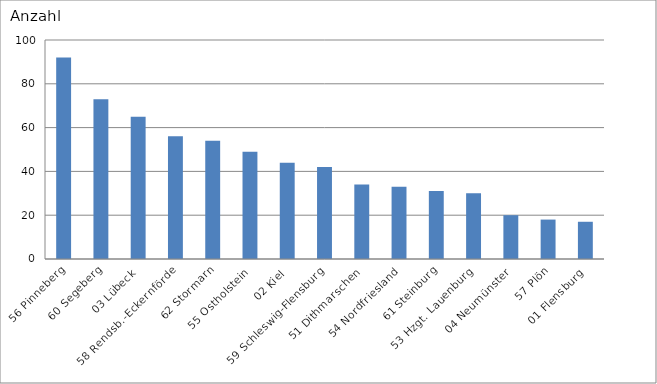
| Category | 56 Pinneberg 60 Segeberg 03 Lübeck 58 Rendsb.-Eckernförde 62 Stormarn 55 Ostholstein 02 Kiel 59 Schleswig-Flensburg 51 Dithmarschen 54 Nordfriesland 61 Steinburg 53 Hzgt. Lauenburg 04 Neumünster 57 Plön 01 Flensburg |
|---|---|
| 56 Pinneberg | 92 |
| 60 Segeberg | 73 |
| 03 Lübeck | 65 |
| 58 Rendsb.-Eckernförde | 56 |
| 62 Stormarn | 54 |
| 55 Ostholstein | 49 |
| 02 Kiel | 44 |
| 59 Schleswig-Flensburg | 42 |
| 51 Dithmarschen | 34 |
| 54 Nordfriesland | 33 |
| 61 Steinburg | 31 |
| 53 Hzgt. Lauenburg | 30 |
| 04 Neumünster | 20 |
| 57 Plön | 18 |
| 01 Flensburg | 17 |